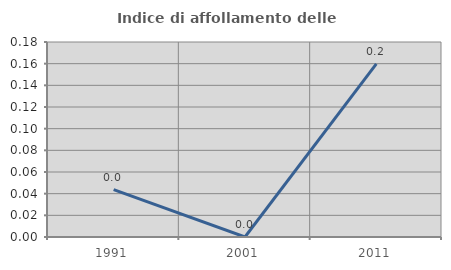
| Category | Indice di affollamento delle abitazioni  |
|---|---|
| 1991.0 | 0.044 |
| 2001.0 | 0 |
| 2011.0 | 0.16 |